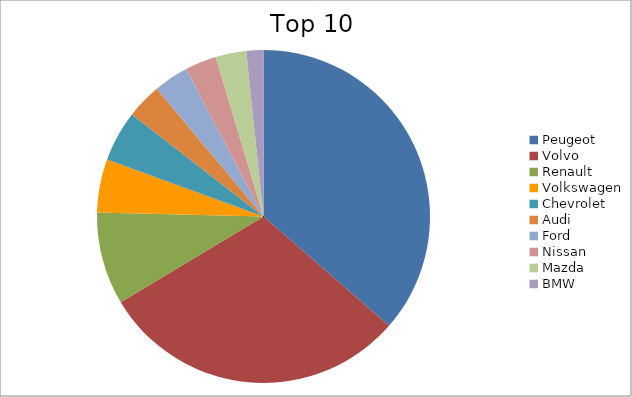
| Category | Series 0 |
|---|---|
| Peugeot | 36.41 |
| Volvo | 29.99 |
| Renault | 8.99 |
| Volkswagen | 5.19 |
| Chevrolet | 4.93 |
| Audi | 3.42 |
| Ford | 3.4 |
| Nissan | 3.04 |
| Mazda | 2.98 |
| BMW | 1.66 |